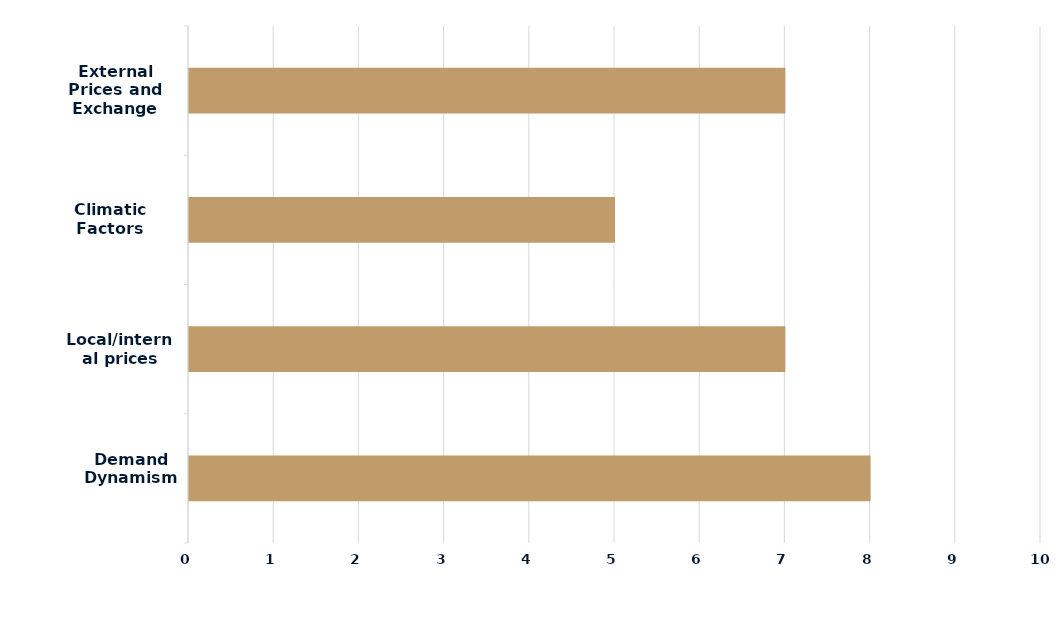
| Category | Series 0 |
|---|---|
| Demand Dynamism | 8 |
| Local/internal prices | 7 |
| Climatic Factors | 5 |
| External Prices and Exchange Rate | 7 |